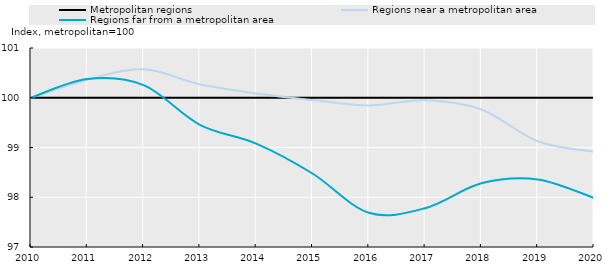
| Category | Metropolitan regions | Regions near a metropolitan area | Regions far from a metropolitan area |
|---|---|---|---|
| 2010.0 | 100 | 100 | 100 |
| 2011.0 | 100 | 100.363 | 100.376 |
| 2012.0 | 100 | 100.571 | 100.252 |
| 2013.0 | 100 | 100.27 | 99.456 |
| 2014.0 | 100 | 100.085 | 99.078 |
| 2015.0 | 100 | 99.953 | 98.477 |
| 2016.0 | 100 | 99.845 | 97.689 |
| 2017.0 | 100 | 99.949 | 97.78 |
| 2018.0 | 100 | 99.763 | 98.28 |
| 2019.0 | 100 | 99.126 | 98.359 |
| 2020.0 | 100 | 98.912 | 97.987 |